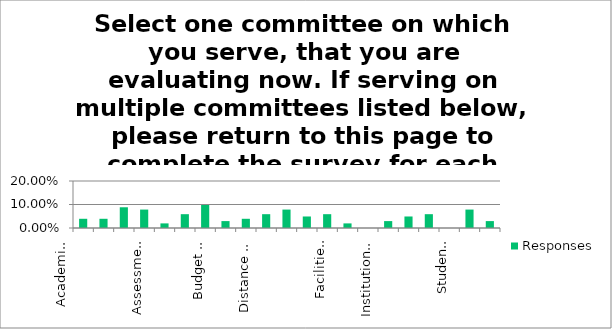
| Category | Responses |
|---|---|
| Academic Senate (Full Senate) | 0.039 |
| Academic Senate (Executive) | 0.039 |
| Academic Standards and Policies | 0.088 |
| Assessment | 0.078 |
| Associate Faculty | 0.02 |
| Guided Pathways | 0.059 |
| Budget Planning | 0.098 |
| College Council | 0.029 |
| Curriculum | 0.039 |
| Distance Education Planning Committee | 0.059 |
| Enrollment Management | 0.078 |
| Professional Development | 0.049 |
| Facilities Planning | 0.059 |
| Faculty Development | 0.02 |
| Faculty Qualifications | 0 |
| Institutional Effectiveness | 0.029 |
| Multicultural & Diversity | 0.049 |
| Program Review | 0.059 |
| Student Equity | 0 |
| Technology Planning | 0.078 |
| Tenure Review | 0.029 |